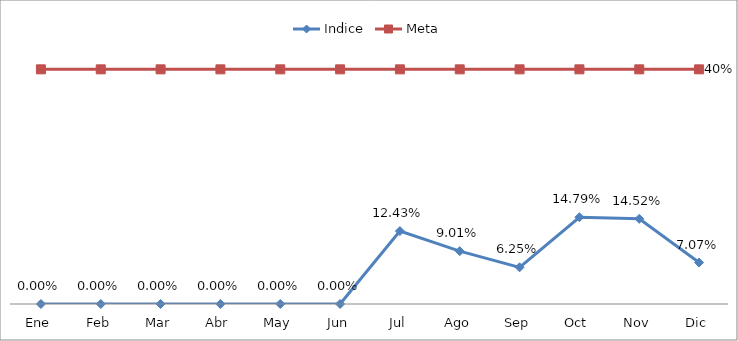
| Category | Indice | Meta |
|---|---|---|
| Ene | 0 | 0.4 |
| Feb | 0 | 0.4 |
| Mar | 0 | 0.4 |
| Abr | 0 | 0.4 |
| May | 0 | 0.4 |
| Jun | 0 | 0.4 |
| Jul | 0.124 | 0.4 |
| Ago | 0.09 | 0.4 |
| Sep | 0.062 | 0.4 |
| Oct | 0.148 | 0.4 |
| Nov | 0.145 | 0.4 |
| Dic | 0.071 | 0.4 |